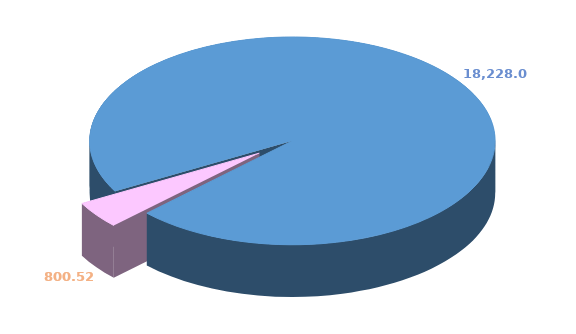
| Category | Series 0 |
|---|---|
| 0 | 18228.006 |
| 1 | 800.523 |